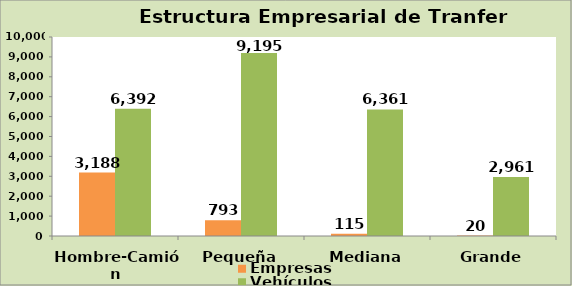
| Category | Empresas | Vehículos |
|---|---|---|
| Hombre-Camión | 3188 | 6392 |
| Pequeña | 793 | 9195 |
| Mediana | 115 | 6361 |
| Grande | 20 | 2961 |